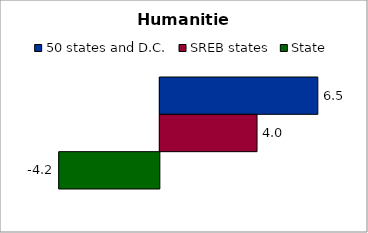
| Category | 50 states and D.C. | SREB states | State |
|---|---|---|---|
| 0 | 6.543 | 4.025 | -4.167 |